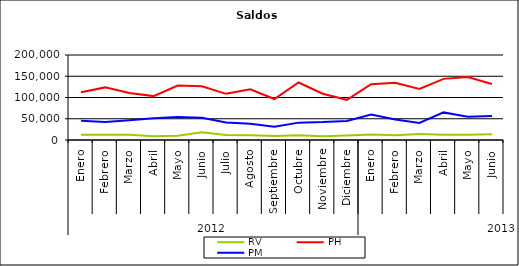
| Category | RV | PH | PM |
|---|---|---|---|
| 0 | 12341.813 | 112514.179 | 45537.16 |
| 1 | 12237.077 | 123774.486 | 42503.398 |
| 2 | 12097.047 | 110658.975 | 46279.761 |
| 3 | 8763.382 | 103284.021 | 51222.341 |
| 4 | 10161.6 | 128235.54 | 54214.606 |
| 5 | 18154.077 | 126306.439 | 52582.755 |
| 6 | 11880.973 | 108609.112 | 41317.962 |
| 7 | 11144.929 | 119136.85 | 38018.164 |
| 8 | 9436.917 | 96445.035 | 31265.858 |
| 9 | 11442.361 | 135264.99 | 40874.284 |
| 10 | 8920.043 | 108829.848 | 42115.15 |
| 11 | 10846.696 | 94519.382 | 44969.431 |
| 12 | 12966.437 | 131380.856 | 59975.653 |
| 13 | 11432.271 | 134655.891 | 48046.612 |
| 14 | 14149.543 | 120343.782 | 40297.909 |
| 15 | 12403.249 | 143830.507 | 64946.114 |
| 16 | 12323.134 | 148139.781 | 54592.514 |
| 17 | 13759.976 | 131634.752 | 56652.701 |